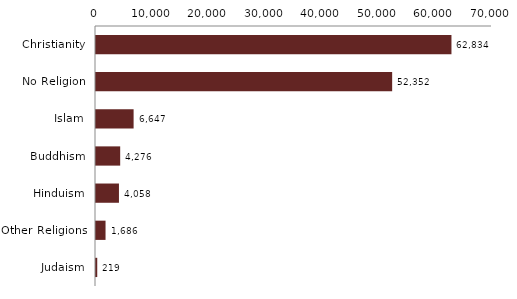
| Category | Series 0 |
|---|---|
| Christianity | 62834 |
| No Religion | 52352 |
| Islam | 6647 |
| Buddhism | 4276 |
| Hinduism | 4058 |
| Other Religions | 1686 |
| Judaism | 219 |